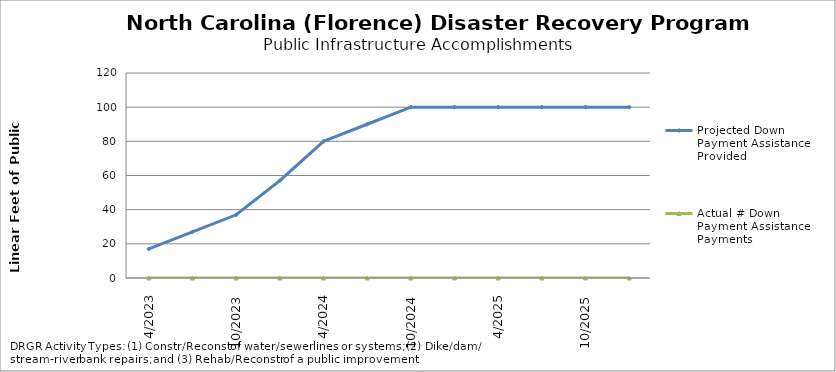
| Category | Projected Down Payment Assistance Provided | Actual # Down Payment Assistance Payments |
|---|---|---|
| 4/2023 | 17 | 0 |
| 7/2023 | 27 | 0 |
| 10/2023 | 37 | 0 |
| 1/2024 | 57 | 0 |
| 4/2024 | 80 | 0 |
| 7/2024 | 90 | 0 |
| 10/2024 | 100 | 0 |
| 1/2025 | 100 | 0 |
| 4/2025 | 100 | 0 |
| 7/2025 | 100 | 0 |
| 10/2025 | 100 | 0 |
| 1/2026 | 100 | 0 |